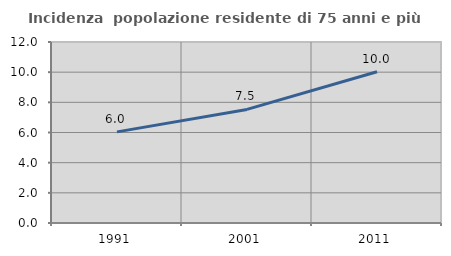
| Category | Incidenza  popolazione residente di 75 anni e più |
|---|---|
| 1991.0 | 6.042 |
| 2001.0 | 7.53 |
| 2011.0 | 10.032 |